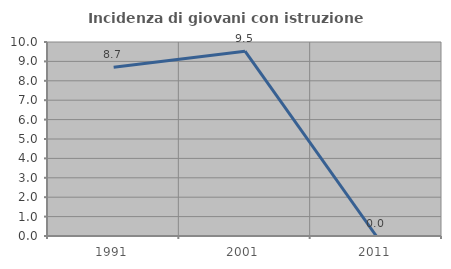
| Category | Incidenza di giovani con istruzione universitaria |
|---|---|
| 1991.0 | 8.696 |
| 2001.0 | 9.524 |
| 2011.0 | 0 |